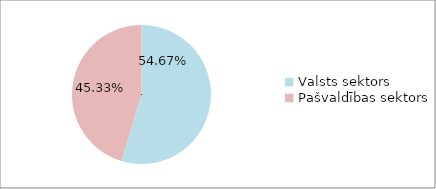
| Category | Series 0 |
|---|---|
| Valsts sektors | 0.547 |
| Pašvaldības sektors | 0.453 |